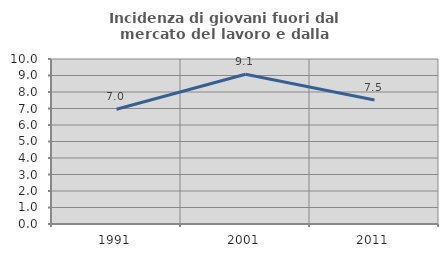
| Category | Incidenza di giovani fuori dal mercato del lavoro e dalla formazione  |
|---|---|
| 1991.0 | 6.952 |
| 2001.0 | 9.075 |
| 2011.0 | 7.517 |